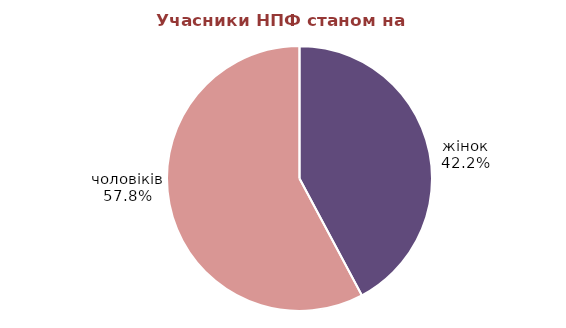
| Category | Series 0 |
|---|---|
| жінок | 369279 |
| чоловіків | 505791 |